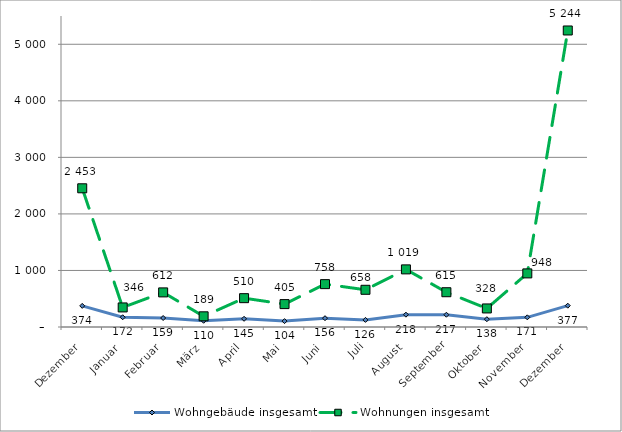
| Category | Wohngebäude insgesamt | Wohnungen insgesamt |
|---|---|---|
| Dezember | 374 | 2453 |
| Januar | 172 | 346 |
| Februar | 159 | 612 |
| März | 110 | 189 |
| April | 145 | 510 |
| Mai | 104 | 405 |
| Juni | 156 | 758 |
| Juli | 126 | 658 |
| August | 218 | 1019 |
| September | 217 | 615 |
| Oktober | 138 | 328 |
| November | 171 | 948 |
| Dezember | 377 | 5244 |